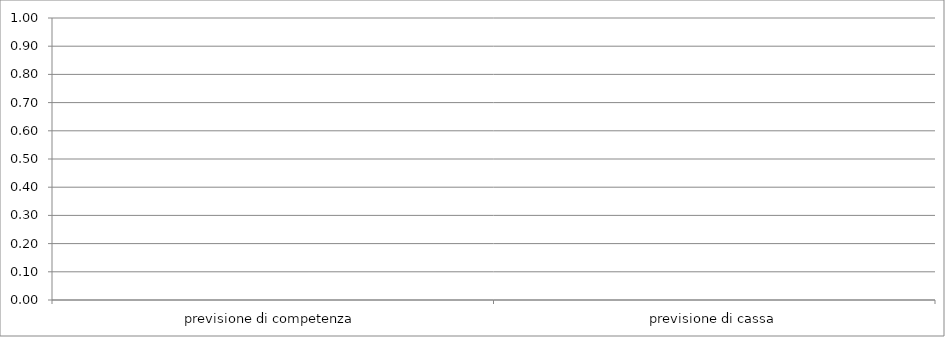
| Category | 0.00 |
|---|---|
| previsione di competenza | 0 |
| previsione di cassa | 0 |